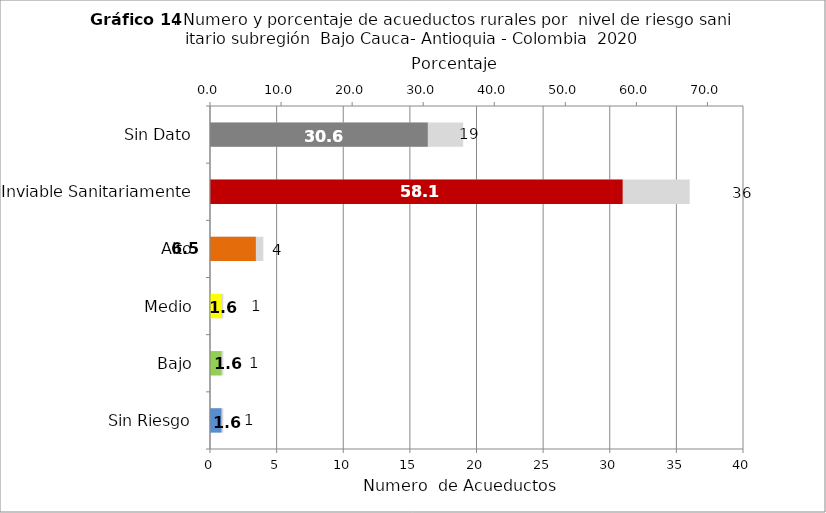
| Category | Número de Sistemas |
|---|---|
| Sin Riesgo | 1 |
| Bajo | 1 |
| Medio | 1 |
| Alto | 4 |
| Inviable Sanitariamente | 36 |
| Sin Dato | 19 |